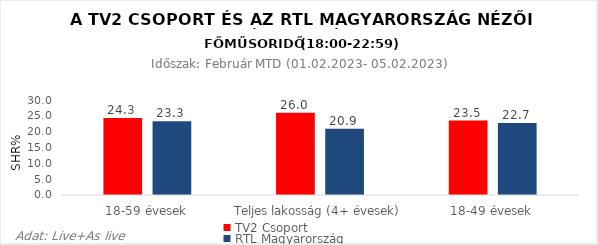
| Category | TV2 Csoport | RTL Magyarország |
|---|---|---|
| 18-59 évesek | 24.3 | 23.3 |
| Teljes lakosság (4+ évesek) | 26 | 20.9 |
| 18-49 évesek | 23.5 | 22.7 |